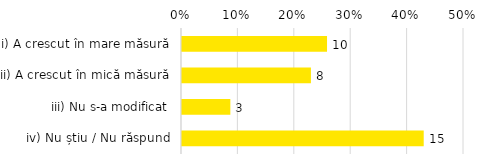
| Category | Total |
|---|---|
| i) A crescut în mare măsură | 0.257 |
| ii) A crescut în mică măsură | 0.229 |
| iii) Nu s-a modificat | 0.086 |
| iv) Nu știu / Nu răspund | 0.429 |